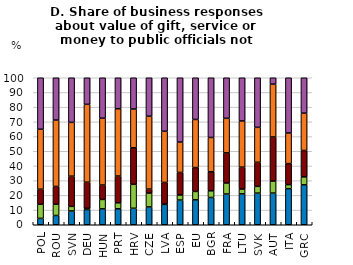
| Category | 201+ EUR | 101-200 EUR | 51-100 EUR | 1-50 EUR | 0 EUR (Any gift is a bribe) |
|---|---|---|---|---|---|
| POL | 4.362 | 9.62 | 10.179 | 40.828 | 35.011 |
| ROU | 6.298 | 7.709 | 12.052 | 45.168 | 28.773 |
| SVN | 9.385 | 3.128 | 20.542 | 36.601 | 30.344 |
| DEU | 10.337 | 0.871 | 17.737 | 52.992 | 18.063 |
| HUN | 10.811 | 6.419 | 9.797 | 45.495 | 27.477 |
| PRT | 10.867 | 4.061 | 18.222 | 45.774 | 21.076 |
| HRV | 11.217 | 16.296 | 24.868 | 26.349 | 21.27 |
| CZE | 12.125 | 9.455 | 2.67 | 49.611 | 26.14 |
| LVA | 13.869 | 0.233 | 14.685 | 34.848 | 36.364 |
| ESP | 16.806 | 3.445 | 15.344 | 20.668 | 43.737 |
| EU | 16.971 | 5.693 | 16.219 | 32.76 | 28.357 |
| BGR | 18.553 | 4.551 | 12.952 | 23.337 | 40.607 |
| FRA | 20.916 | 7.492 | 20.499 | 23.517 | 27.575 |
| LTU | 21.017 | 3.277 | 14.915 | 31.412 | 29.379 |
| SVK | 21.52 | 4.604 | 16.381 | 23.769 | 33.726 |
| AUT | 21.564 | 8.14 | 30.021 | 35.941 | 4.334 |
| ITA | 24.55 | 2.751 | 14.286 | 20.847 | 37.566 |
| GRC | 27.178 | 5.394 | 17.946 | 25.415 | 24.066 |